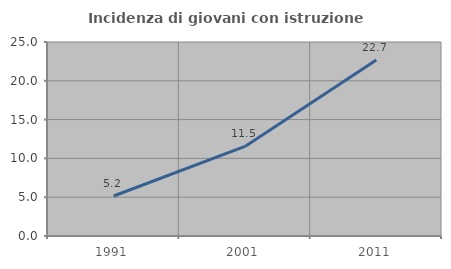
| Category | Incidenza di giovani con istruzione universitaria |
|---|---|
| 1991.0 | 5.157 |
| 2001.0 | 11.538 |
| 2011.0 | 22.696 |